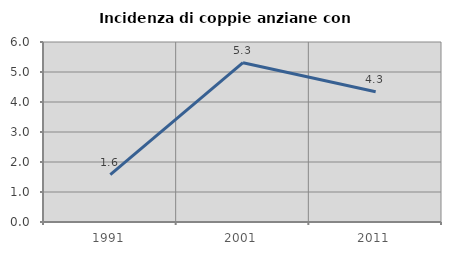
| Category | Incidenza di coppie anziane con figli |
|---|---|
| 1991.0 | 1.582 |
| 2001.0 | 5.31 |
| 2011.0 | 4.339 |